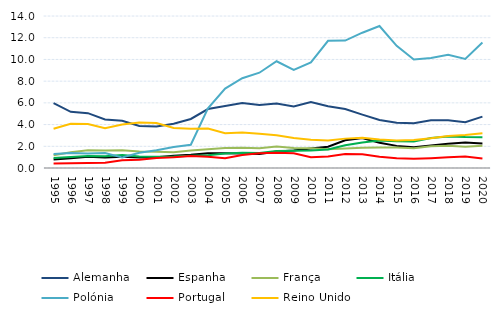
| Category | Alemanha | Espanha | França | Itália | Polónia | Portugal | Reino Unido |
|---|---|---|---|---|---|---|---|
| 1995.0 | 5.979 | 0.786 | 1.172 | 0.926 | 1.3 | 0.421 | 3.614 |
| 1996.0 | 5.173 | 0.887 | 1.441 | 1.024 | 1.377 | 0.44 | 4.082 |
| 1997.0 | 5.05 | 1.033 | 1.645 | 1.116 | 1.345 | 0.46 | 4.054 |
| 1998.0 | 4.465 | 0.957 | 1.622 | 1.078 | 1.374 | 0.488 | 3.661 |
| 1999.0 | 4.358 | 1.031 | 1.638 | 1.19 | 0.98 | 0.707 | 4.012 |
| 2000.0 | 3.877 | 0.971 | 1.528 | 1.07 | 1.408 | 0.76 | 4.188 |
| 2001.0 | 3.825 | 0.994 | 1.486 | 1.028 | 1.641 | 0.912 | 4.134 |
| 2002.0 | 4.068 | 1.139 | 1.46 | 1.054 | 1.927 | 0.981 | 3.692 |
| 2003.0 | 4.515 | 1.225 | 1.605 | 1.124 | 2.138 | 1.116 | 3.616 |
| 2004.0 | 5.428 | 1.367 | 1.724 | 1.165 | 5.49 | 1.047 | 3.636 |
| 2005.0 | 5.708 | 1.361 | 1.84 | 1.327 | 7.309 | 0.899 | 3.194 |
| 2006.0 | 5.977 | 1.336 | 1.865 | 1.399 | 8.269 | 1.197 | 3.268 |
| 2007.0 | 5.806 | 1.292 | 1.828 | 1.386 | 8.777 | 1.35 | 3.16 |
| 2008.0 | 5.931 | 1.517 | 1.989 | 1.555 | 9.83 | 1.395 | 3.014 |
| 2009.0 | 5.67 | 1.61 | 1.842 | 1.578 | 9.039 | 1.355 | 2.756 |
| 2010.0 | 6.081 | 1.79 | 1.813 | 1.615 | 9.727 | 0.991 | 2.612 |
| 2011.0 | 5.681 | 1.967 | 1.73 | 1.699 | 11.714 | 1.06 | 2.528 |
| 2012.0 | 5.43 | 2.551 | 1.792 | 2.087 | 11.739 | 1.295 | 2.706 |
| 2013.0 | 4.912 | 2.766 | 1.857 | 2.34 | 12.461 | 1.262 | 2.787 |
| 2014.0 | 4.415 | 2.316 | 1.89 | 2.533 | 13.076 | 1.031 | 2.616 |
| 2015.0 | 4.171 | 2.038 | 1.877 | 2.456 | 11.255 | 0.909 | 2.538 |
| 2016.0 | 4.115 | 1.904 | 1.829 | 2.43 | 9.993 | 0.85 | 2.573 |
| 2017.0 | 4.399 | 2.07 | 2.001 | 2.766 | 10.125 | 0.905 | 2.75 |
| 2018.0 | 4.391 | 2.227 | 2.04 | 2.903 | 10.428 | 0.985 | 2.943 |
| 2019.0 | 4.213 | 2.347 | 1.961 | 2.85 | 10.052 | 1.056 | 3.039 |
| 2020.0 | 4.733 | 2.261 | 2.042 | 2.833 | 11.561 | 0.875 | 3.196 |